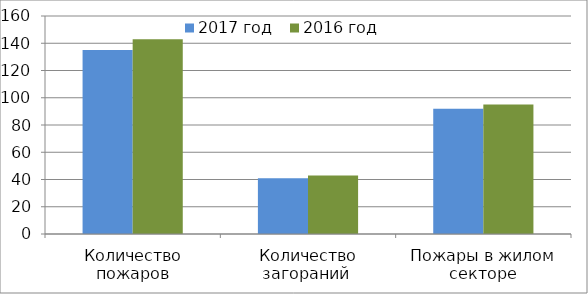
| Category | 2017 год | 2016 год |
|---|---|---|
| Количество пожаров | 135 | 143 |
| Количество загораний  | 41 | 43 |
| Пожары в жилом секторе | 92 | 95 |